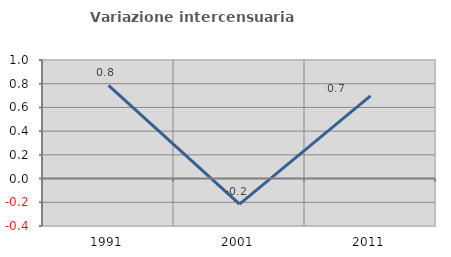
| Category | Variazione intercensuaria annua |
|---|---|
| 1991.0 | 0.787 |
| 2001.0 | -0.216 |
| 2011.0 | 0.698 |